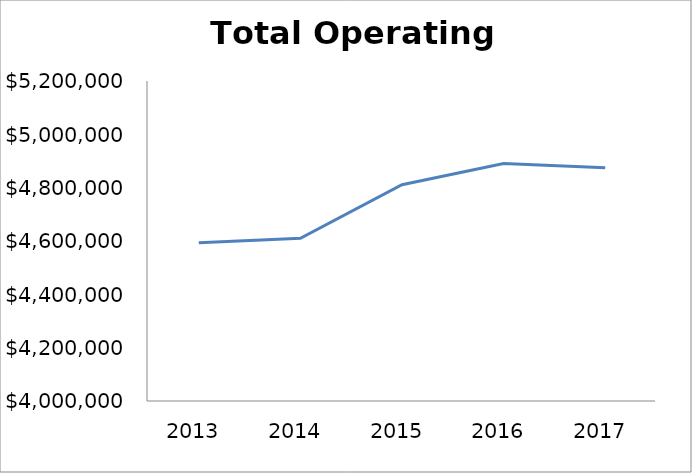
| Category | Series 0 |
|---|---|
| 2013.0 | 4593305 |
| 2014.0 | 4610435.73 |
| 2015.0 | 4811281.925 |
| 2016.0 | 4890777.4 |
| 2017.0 | 4874955.6 |